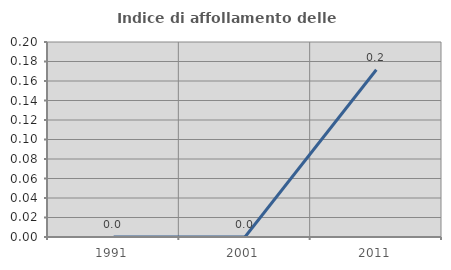
| Category | Indice di affollamento delle abitazioni  |
|---|---|
| 1991.0 | 0 |
| 2001.0 | 0 |
| 2011.0 | 0.172 |